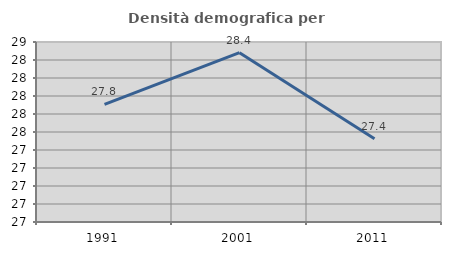
| Category | Densità demografica |
|---|---|
| 1991.0 | 27.808 |
| 2001.0 | 28.381 |
| 2011.0 | 27.426 |